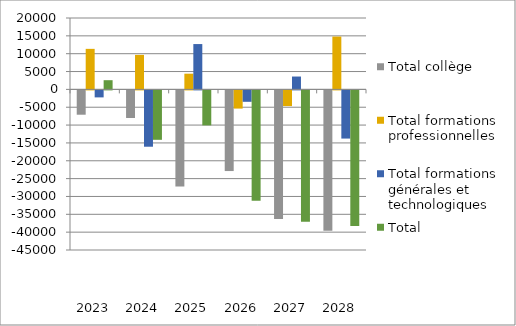
| Category | Total collège | Total formations professionnelles | Total formations générales et technologiques | Total |
|---|---|---|---|---|
| 2023.0 | -6816 | 11355 | -1963 | 2576 |
| 2024.0 | -7730 | 9666 | -15785 | -13849 |
| 2025.0 | -26900 | 4400 | 12700 | -9800 |
| 2026.0 | -22600 | -5100 | -3200 | -30900 |
| 2027.0 | -36000 | -4400 | 3600 | -36800 |
| 2028.0 | -39300 | 14800 | -13500 | -38000 |